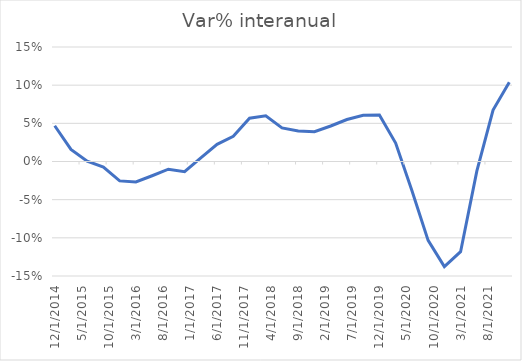
| Category | Series 0 |
|---|---|
| 12/20/14 | 0.047 |
| 3/20/15 | 0.016 |
| 6/18/15 | 0 |
| 9/16/15 | -0.007 |
| 12/15/15 | -0.025 |
| 3/14/16 | -0.027 |
| 6/12/16 | -0.019 |
| 9/10/16 | -0.01 |
| 12/9/16 | -0.013 |
| 3/9/17 | 0.005 |
| 6/7/17 | 0.022 |
| 9/5/17 | 0.033 |
| 12/4/17 | 0.057 |
| 3/30/18 | 0.06 |
| 6/28/18 | 0.044 |
| 9/26/18 | 0.04 |
| 12/25/18 | 0.039 |
| 3/25/19 | 0.046 |
| 6/23/19 | 0.055 |
| 9/21/19 | 0.061 |
| 12/20/19 | 0.061 |
| 3/19/20 | 0.024 |
| 6/17/20 | -0.038 |
| 9/15/20 | -0.103 |
| 12/14/20 | -0.138 |
| 3/14/21 | -0.118 |
| 6/12/21 | -0.013 |
| 9/10/21 | 0.067 |
| 12/9/21 | 0.104 |